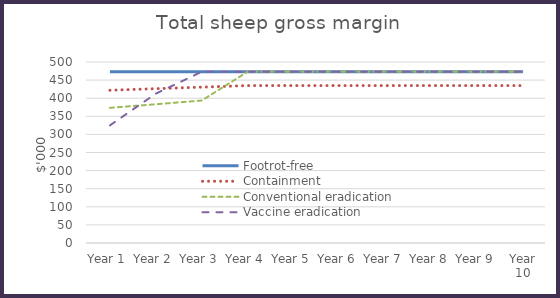
| Category | Footrot-free | Containment | Conventional eradication | Vaccine eradication |
|---|---|---|---|---|
| Year 1 | 473.05 | 422.008 | 373.423 | 324.943 |
| Year 2 | 473.05 | 426.295 | 383.275 | 412.645 |
| Year 3 | 473.05 | 430.553 | 393.625 | 473.05 |
| Year 4 | 473.05 | 434.844 | 473.05 | 473.05 |
| Year 5 | 473.05 | 434.844 | 473.05 | 473.05 |
| Year 6 | 473.05 | 434.844 | 473.05 | 473.05 |
| Year 7 | 473.05 | 434.844 | 473.05 | 473.05 |
| Year 8 | 473.05 | 434.844 | 473.05 | 473.05 |
| Year 9 | 473.05 | 434.844 | 473.05 | 473.05 |
| Year 10 | 473.05 | 434.844 | 473.05 | 473.05 |